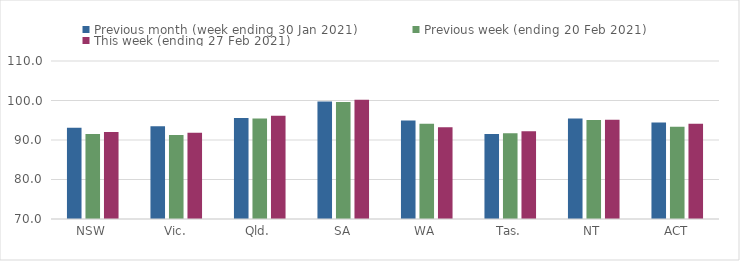
| Category | Previous month (week ending 30 Jan 2021) | Previous week (ending 20 Feb 2021) | This week (ending 27 Feb 2021) |
|---|---|---|---|
| NSW | 93.11 | 91.52 | 92 |
| Vic. | 93.48 | 91.25 | 91.81 |
| Qld. | 95.6 | 95.42 | 96.17 |
| SA | 99.75 | 99.63 | 100.18 |
| WA | 94.93 | 94.1 | 93.24 |
| Tas. | 91.49 | 91.71 | 92.19 |
| NT | 95.47 | 95.09 | 95.13 |
| ACT | 94.46 | 93.37 | 94.1 |